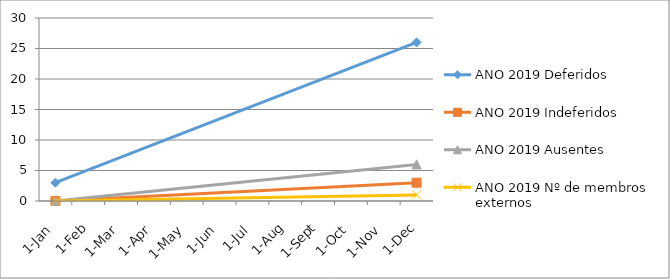
| Category | ANO 2019 |
|---|---|
| 2019-12-13 | 1 |
| 2019-01-08 | 0 |